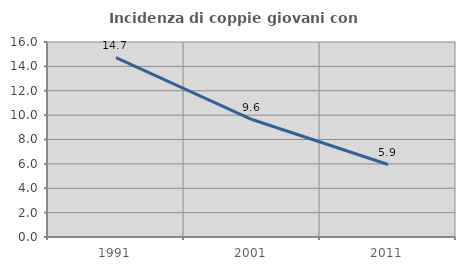
| Category | Incidenza di coppie giovani con figli |
|---|---|
| 1991.0 | 14.725 |
| 2001.0 | 9.639 |
| 2011.0 | 5.945 |